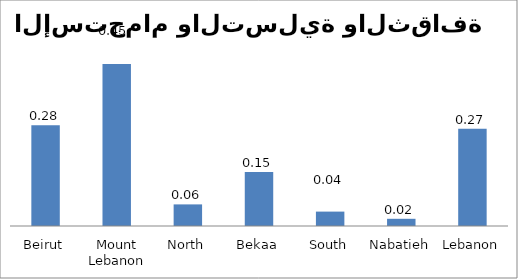
| Category | 09 |
|---|---|
| Beirut | 0.28 |
| Mount Lebanon | 0.45 |
| North | 0.06 |
| Bekaa | 0.15 |
| South | 0.04 |
| Nabatieh | 0.02 |
| Lebanon | 0.27 |